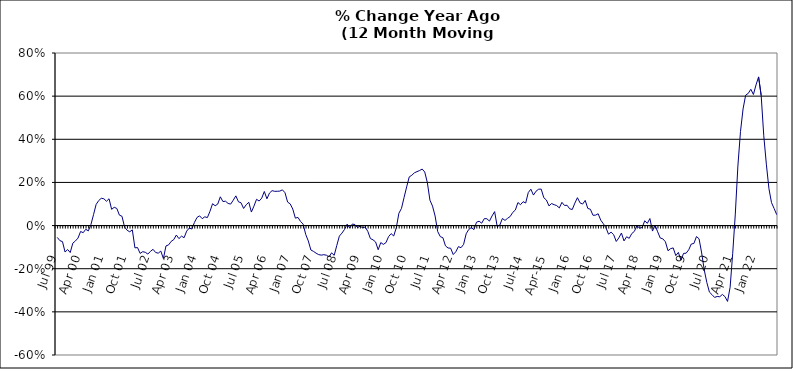
| Category | Series 0 |
|---|---|
| Jul 99 | -0.055 |
| Aug 99 | -0.07 |
| Sep 99 | -0.074 |
| Oct 99 | -0.123 |
| Nov 99 | -0.111 |
| Dec 99 | -0.125 |
| Jan 00 | -0.082 |
| Feb 00 | -0.071 |
| Mar 00 | -0.058 |
| Apr 00 | -0.027 |
| May 00 | -0.033 |
| Jun 00 | -0.017 |
| Jul 00 | -0.025 |
| Aug 00 | 0.005 |
| Sep 00 | 0.05 |
| Oct 00 | 0.098 |
| Nov 00 | 0.116 |
| Dec 00 | 0.127 |
| Jan 01 | 0.124 |
| Feb 01 | 0.113 |
| Mar 01 | 0.124 |
| Apr 01 | 0.075 |
| May 01 | 0.085 |
| Jun 01 | 0.08 |
| Jul 01 | 0.048 |
| Aug 01 | 0.043 |
| Sep 01 | -0.007 |
| Oct 01 | -0.022 |
| Nov 01 | -0.029 |
| Dec 01 | -0.02 |
| Jan 02 | -0.103 |
| Feb 02 | -0.102 |
| Mar 02 | -0.129 |
| Apr 02 | -0.121 |
| May 02 | -0.124 |
| Jun 02 | -0.132 |
| Jul 02 | -0.119 |
| Aug 02 | -0.11 |
| Sep 02 | -0.125 |
| Oct 02 | -0.128 |
| Nov 02 | -0.118 |
| Dec 02 | -0.153 |
| Jan 03 | -0.094 |
| Feb 03 | -0.09 |
| Mar 03 | -0.073 |
| Apr 03 | -0.065 |
| May 03 | -0.044 |
| Jun 03 | -0.06 |
| Jul 03 | -0.049 |
| Aug 03 | -0.056 |
| Sep 03 | -0.026 |
| Oct 03 | -0.012 |
| Nov 03 | -0.016 |
| Dec 03 | 0.014 |
| Jan 04 | 0.038 |
| Feb 04 | 0.045 |
| Mar 04 | 0.032 |
| Apr 04 | 0.041 |
| May 04 | 0.037 |
| Jun 04 | 0.066 |
| Jul 04 | 0.101 |
| Aug 04 | 0.092 |
| Sep 04 | 0.1 |
| Oct 04 | 0.133 |
| Nov 04 | 0.111 |
| Dec 04 | 0.113 |
| Jan 05 | 0.103 |
| Feb 05 | 0.1 |
| Mar 05 | 0.118 |
| Apr 05 | 0.138 |
| May 05 | 0.11 |
| Jun 05 | 0.106 |
| Jul 05 | 0.079 |
| Aug 05 | 0.097 |
| Sep 05 | 0.108 |
| Oct 05 | 0.063 |
| Nov 05 | 0.09 |
| Dec 05 | 0.122 |
| Jan 06 | 0.114 |
| Feb 06 | 0.127 |
| Mar 06 | 0.158 |
| Apr 06 | 0.124 |
| May 06 | 0.151 |
| Jun 06 | 0.162 |
| Jul 06 | 0.159 |
| Aug 06 | 0.159 |
| Sep 06 | 0.16 |
| Oct 06 | 0.166 |
| Nov 06 | 0.152 |
| Dec 06 | 0.109 |
| Jan 07 | 0.101 |
| Feb 07 | 0.076 |
| Mar 07 | 0.034 |
| Apr 07 | 0.038 |
| May 07 | 0.019 |
| Jun 07 | 0.007 |
| Jul 07 | -0.041 |
| Aug 07 | -0.071 |
| Sep 07 | -0.113 |
| Oct 07 | -0.12 |
| Nov 07 | -0.128 |
| Dec 07 | -0.135 |
| Jan 08 | -0.137 |
| Feb 08 | -0.135 |
| Mar 08 | -0.137 |
| Apr 08 | -0.145 |
| May 08 | -0.126 |
| Jun 08 | -0.138 |
| Jul 08 | -0.093 |
| Aug 08 | -0.049 |
| Sep-08 | -0.035 |
| Oct 08 | -0.018 |
| Nov 08 | 0.007 |
| Dec 08 | -0.011 |
| Jan 09 | 0.007 |
| Feb 09 | 0.005 |
| Mar 09 | -0.009 |
| Apr 09 | -0.003 |
| May 09 | -0.01 |
| Jun 09 | -0.007 |
| Jul 09 | -0.027 |
| Aug 09 | -0.06 |
| Sep 09 | -0.066 |
| Oct 09 | -0.076 |
| Nov 09 | -0.112 |
| Dec 09 | -0.079 |
| Jan 10 | -0.087 |
| Feb 10 | -0.079 |
| Mar 10 | -0.052 |
| Apr 10 | -0.037 |
| May 10 | -0.048 |
| Jun 10 | -0.01 |
| Jul 10 | 0.057 |
| Aug 10 | 0.08 |
| Sep 10 | 0.13 |
| Oct 10 | 0.179 |
| Nov 10 | 0.226 |
| Dec 10 | 0.233 |
| Jan 11 | 0.245 |
| Feb 11 | 0.25 |
| Mar 11 | 0.255 |
| Apr 11 | 0.262 |
| May 11 | 0.248 |
| Jun 11 | 0.199 |
| Jul 11 | 0.118 |
| Aug 11 | 0.09 |
| Sep 11 | 0.044 |
| Oct 11 | -0.028 |
| Nov 11 | -0.051 |
| Dec 11 | -0.056 |
| Jan 12 | -0.094 |
| Feb 12 | -0.104 |
| Mar 12 | -0.105 |
| Apr 12 | -0.134 |
| May 12 | -0.121 |
| Jun 12 | -0.098 |
| Jul 12 | -0.103 |
| Aug 12 | -0.087 |
| Sep 12 | -0.038 |
| Oct 12 | -0.018 |
| Nov 12 | -0.009 |
| Dec 12 | -0.019 |
| Jan 13 | 0.016 |
| Feb-13 | 0.02 |
| Mar-13 | 0.011 |
| Apr 13 | 0.032 |
| May 13 | 0.032 |
| Jun-13 | 0.021 |
| Jul 13 | 0.045 |
| Aug 13 | 0.065 |
| Sep 13 | -0.005 |
| Oct 13 | 0.002 |
| Nov 13 | 0.033 |
| Dec 13 | 0.024 |
| Jan 14 | 0.034 |
| Feb-14 | 0.042 |
| Mar 14 | 0.061 |
| Apr 14 | 0.072 |
| May 14 | 0.107 |
| Jun 14 | 0.097 |
| Jul-14 | 0.111 |
| Aug-14 | 0.105 |
| Sep 14 | 0.153 |
| Oct 14 | 0.169 |
| Nov 14 | 0.141 |
| Dec 14 | 0.159 |
| Jan 15 | 0.169 |
| Feb 15 | 0.169 |
| Mar 15 | 0.129 |
| Apr-15 | 0.118 |
| May 15 | 0.091 |
| Jun-15 | 0.102 |
| Jul 15 | 0.097 |
| Aug 15 | 0.092 |
| Sep 15 | 0.082 |
| Oct 15 | 0.108 |
| Nov 15 | 0.093 |
| Dec 15 | 0.094 |
| Jan 16 | 0.078 |
| Feb 16 | 0.075 |
| Mar 16 | 0.104 |
| Apr 16 | 0.129 |
| May 16 | 0.105 |
| Jun 16 | 0.1 |
| Jul 16 | 0.117 |
| Aug 16 | 0.08 |
| Sep 16 | 0.076 |
| Oct 16 | 0.048 |
| Nov 16 | 0.048 |
| Dec 16 | 0.055 |
| Jan 17 | 0.025 |
| Feb 17 | 0.009 |
| Mar 17 | -0.01 |
| Apr 17 | -0.04 |
| May 17 | -0.031 |
| Jun 17 | -0.042 |
| Jul 17 | -0.074 |
| Aug 17 | -0.057 |
| Sep 17 | -0.035 |
| Oct 17 | -0.071 |
| Nov 17 | -0.052 |
| Dec 17 | -0.059 |
| Jan 18 | -0.037 |
| Feb 18 | -0.027 |
| Mar 18 | 0 |
| Apr 18 | -0.012 |
| May 18 | -0.009 |
| Jun 18 | 0.022 |
| Jul 18 | 0.01 |
| Aug 18 | 0.033 |
| Sep 18 | -0.025 |
| Oct 18 | 0.002 |
| Nov 18 | -0.029 |
| Dec 18 | -0.058 |
| Jan 19 | -0.061 |
| Feb 19 | -0.075 |
| Mar 19 | -0.117 |
| Apr 19 | -0.107 |
| May 19 | -0.104 |
| Jun 19 | -0.139 |
| Jul 19 | -0.124 |
| Aug 19 | -0.16 |
| Sep 19 | -0.129 |
| Oct 19 | -0.128 |
| Nov 19 | -0.112 |
| Dec 19 | -0.085 |
| Jan 20 | -0.083 |
| Feb 20 | -0.051 |
| Mar 20 | -0.061 |
| Apr 20 | -0.127 |
| May 20 | -0.206 |
| Jun 20 | -0.264 |
| Jul 20 | -0.308 |
| Aug 20 | -0.32 |
| Sep 20 | -0.333 |
| Oct 20 | -0.329 |
| Nov 20 | -0.33 |
| Dec 20 | -0.319 |
| Jan 21 | -0.329 |
| Feb 21 | -0.352 |
| Mar 21 | -0.286 |
| Apr 21 | -0.129 |
| May 21 | 0.053 |
| Jun 21 | 0.276 |
| Jul 21 | 0.435 |
| Aug 21 | 0.541 |
| Sep 21 | 0.604 |
| Oct 21 | 0.613 |
| Nov 21 | 0.632 |
| Dec 21 | 0.608 |
| Jan 22 | 0.652 |
| Feb 22 | 0.689 |
| Mar 22 | 0.603 |
| Apr 22 | 0.416 |
| May 22 | 0.285 |
| Jun 22 | 0.171 |
| Jul 22 | 0.106 |
| Aug 22 | 0.079 |
| Sep 22 | 0.051 |